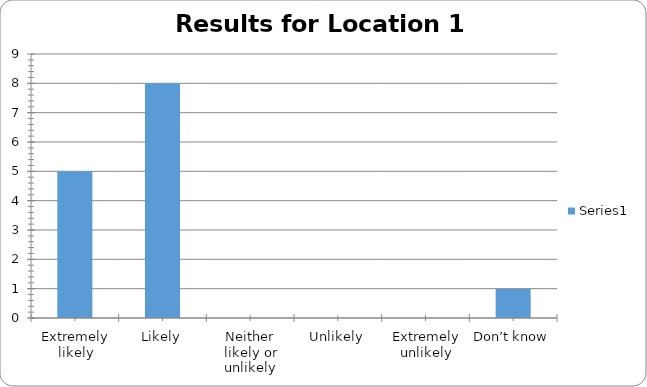
| Category | Series 0 |
|---|---|
| Extremely likely | 5 |
| Likely | 8 |
| Neither likely or unlikely | 0 |
| Unlikely | 0 |
| Extremely unlikely | 0 |
| Don’t know | 1 |